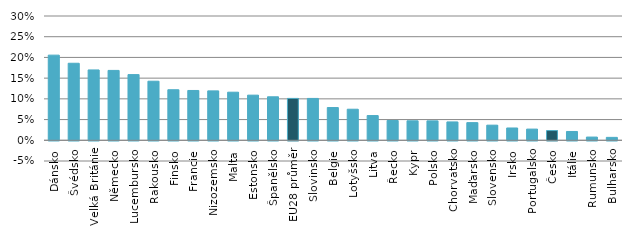
| Category | celkem |
|---|---|
| Dánsko | 0.206 |
| Švédsko | 0.186 |
| Velká Británie | 0.17 |
| Německo | 0.169 |
| Lucembursko | 0.158 |
| Rakousko | 0.143 |
| Finsko | 0.122 |
| Francie | 0.12 |
| Nizozemsko | 0.119 |
| Malta | 0.116 |
| Estonsko | 0.109 |
| Španělsko | 0.105 |
| EU28 průměr | 0.101 |
| Slovinsko | 0.101 |
| Belgie | 0.079 |
| Lotyšsko | 0.075 |
| Litva | 0.06 |
| Řecko | 0.048 |
| Kypr | 0.047 |
| Polsko | 0.047 |
| Chorvatsko | 0.044 |
| Maďarsko | 0.043 |
| Slovensko | 0.037 |
| Irsko | 0.03 |
| Portugalsko | 0.027 |
| Česko | 0.023 |
| Itálie | 0.021 |
| Rumunsko | 0.008 |
| Bulharsko | 0.007 |